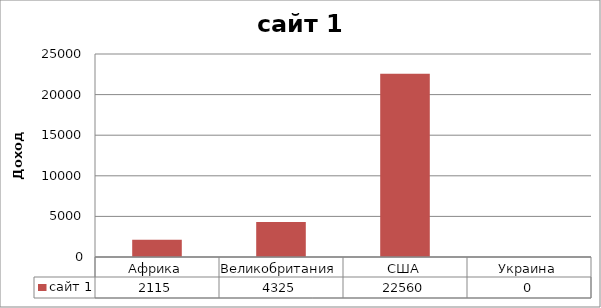
| Category | сайт 1 |
|---|---|
| Африка | 2115 |
| Великобритания  | 4325 |
| США | 22560 |
| Украина | 0 |